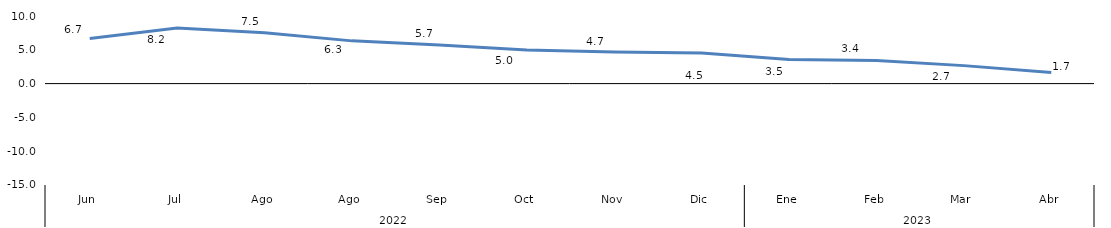
| Category | Bogotá |
|---|---|
| 0 | 6.661 |
| 1 | 8.213 |
| 2 | 7.511 |
| 3 | 6.321 |
| 4 | 5.714 |
| 5 | 4.965 |
| 6 | 4.66 |
| 7 | 4.528 |
| 8 | 3.549 |
| 9 | 3.432 |
| 10 | 2.659 |
| 11 | 1.659 |